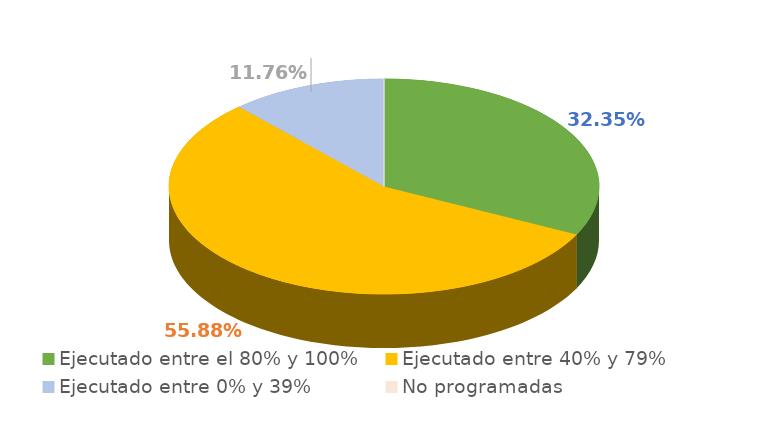
| Category | Series 0 |
|---|---|
| Ejecutado entre el 80% y 100% | 0.324 |
| Ejecutado entre 40% y 79% | 0.559 |
| Ejecutado entre 0% y 39% | 0.118 |
| No programadas | 0 |